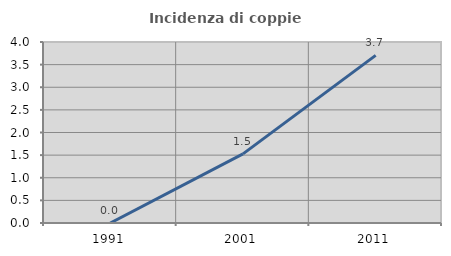
| Category | Incidenza di coppie miste |
|---|---|
| 1991.0 | 0 |
| 2001.0 | 1.527 |
| 2011.0 | 3.704 |